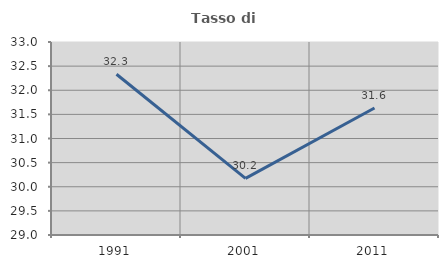
| Category | Tasso di occupazione   |
|---|---|
| 1991.0 | 32.331 |
| 2001.0 | 30.172 |
| 2011.0 | 31.633 |